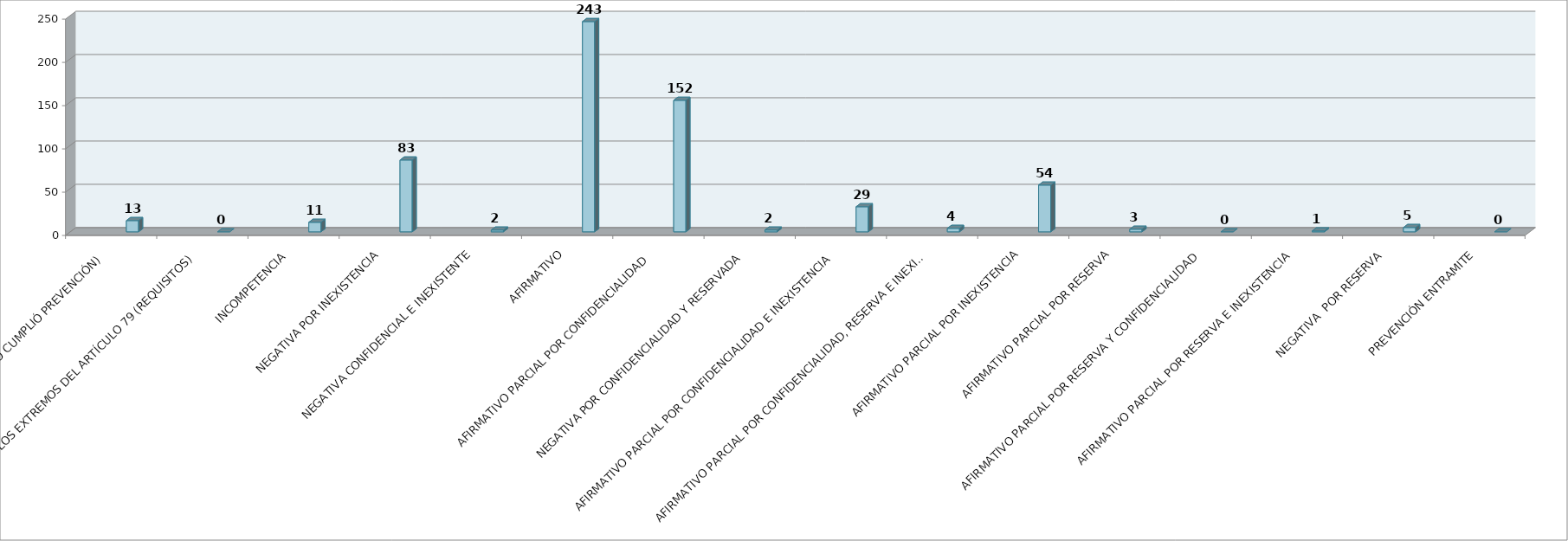
| Category | Series 0 | Series 1 | Series 2 | Series 3 | Series 4 | Series 5 |
|---|---|---|---|---|---|---|
| SE TIENE POR NO PRESENTADA ( NO CUMPLIÓ PREVENCIÓN) |  |  |  |  | 13 |  |
| NO CUMPLIO CON LOS EXTREMOS DEL ARTÍCULO 79 (REQUISITOS) |  |  |  |  | 0 |  |
| INCOMPETENCIA  |  |  |  |  | 11 |  |
| NEGATIVA POR INEXISTENCIA |  |  |  |  | 83 |  |
| NEGATIVA CONFIDENCIAL E INEXISTENTE |  |  |  |  | 2 |  |
| AFIRMATIVO |  |  |  |  | 243 |  |
| AFIRMATIVO PARCIAL POR CONFIDENCIALIDAD  |  |  |  |  | 152 |  |
| NEGATIVA POR CONFIDENCIALIDAD Y RESERVADA |  |  |  |  | 2 |  |
| AFIRMATIVO PARCIAL POR CONFIDENCIALIDAD E INEXISTENCIA |  |  |  |  | 29 |  |
| AFIRMATIVO PARCIAL POR CONFIDENCIALIDAD, RESERVA E INEXISTENCIA |  |  |  |  | 4 |  |
| AFIRMATIVO PARCIAL POR INEXISTENCIA |  |  |  |  | 54 |  |
| AFIRMATIVO PARCIAL POR RESERVA |  |  |  |  | 3 |  |
| AFIRMATIVO PARCIAL POR RESERVA Y CONFIDENCIALIDAD |  |  |  |  | 0 |  |
| AFIRMATIVO PARCIAL POR RESERVA E INEXISTENCIA |  |  |  |  | 1 |  |
| NEGATIVA  POR RESERVA |  |  |  |  | 5 |  |
| PREVENCIÓN ENTRAMITE |  |  |  |  | 0 |  |